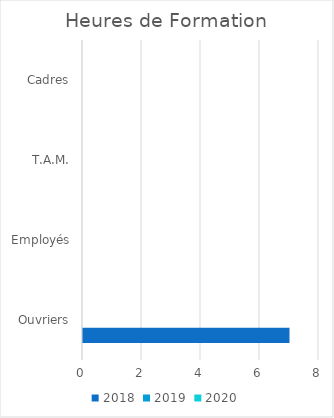
| Category | 2018 | 2019 | 2020 |
|---|---|---|---|
| Ouvriers | 7 | 0 | 0 |
| Employés | 0 | 0 | 0 |
| T.A.M. | 0 | 0 | 0 |
| Cadres | 0 | 0 | 0 |